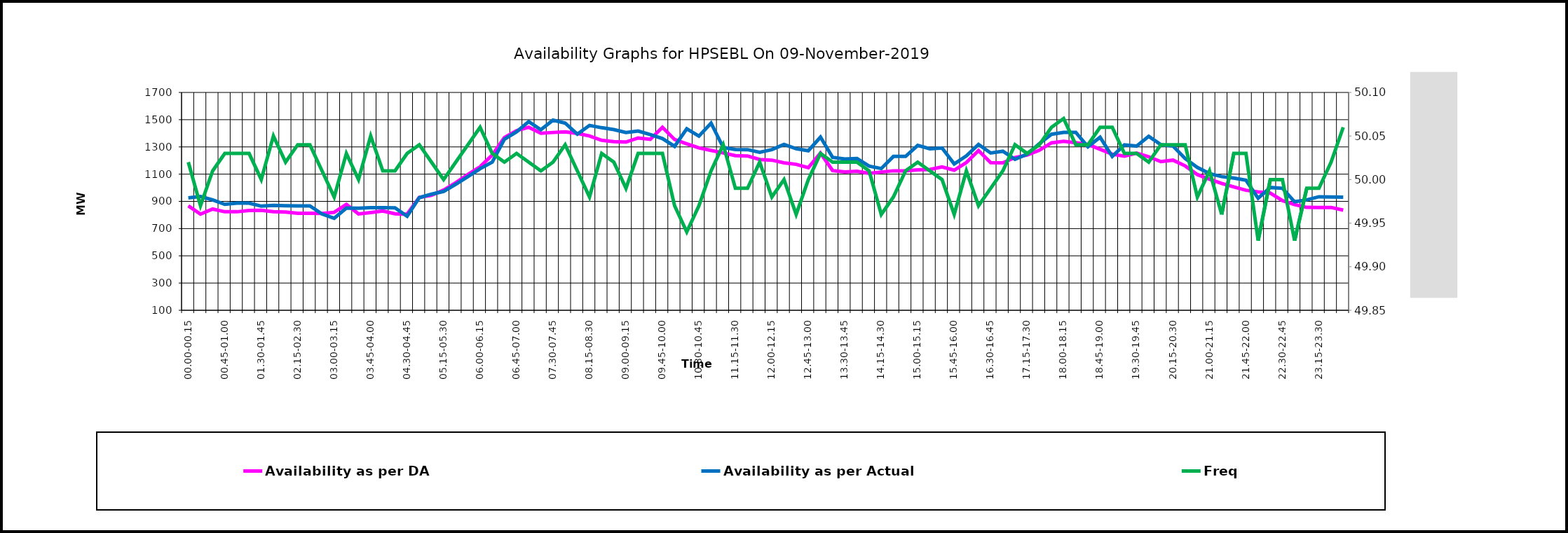
| Category | Availability as per DA | Availability as per Actual |
|---|---|---|
| 00.00-00.15 | 867.346 | 926 |
| 00.15-00.30 | 805.943 | 936 |
| 00.30-00.45 | 843.511 | 911 |
| 00.45-01.00 | 823.511 | 878 |
| 01.00-01.15 | 823.511 | 887 |
| 01.15-01.30 | 833.511 | 887 |
| 01.30-01.45 | 834.676 | 865 |
| 01.45-02:00 | 824.676 | 870 |
| 02.00-02.15 | 822.068 | 868 |
| 02.15-02.30 | 812.068 | 867 |
| 02.30-02.45 | 812.068 | 867 |
| 02.45-03:00 | 811.412 | 807 |
| 03.00-03.15 | 819.3 | 776 |
| 03.15-03.30 | 877.586 | 851 |
| 03.30-03.45 | 807.3 | 850 |
| 03.45-04.00 | 817.3 | 854 |
| 04.00-04.15 | 829.131 | 854 |
| 04.15-04.30 | 809.141 | 853 |
| 04.30-04.45 | 805.678 | 791 |
| 04.45-05.00 | 929.084 | 927 |
| 05.00-05.15 | 944.459 | 953 |
| 05.15-05.30 | 983.251 | 973 |
| 05.30-05.45 | 1037.119 | 1026 |
| 05.45-06.00 | 1098.165 | 1082 |
| 06.00-06.15 | 1154.524 | 1140 |
| 06.15-06.30 | 1240.441 | 1189 |
| 06.30-06.45 | 1368.178 | 1356 |
| 06.45-07.00 | 1419.502 | 1411 |
| 07.00-07.15 | 1444.263 | 1486 |
| 07.15-07.30 | 1400.936 | 1426 |
| 07.30-07.45 | 1406.117 | 1497 |
| 07.45-08.00 | 1410.971 | 1475 |
| 08.00-08.15 | 1399.314 | 1394 |
| 08.15-08.30 | 1380.4 | 1458 |
| 08.30-08.45 | 1348.415 | 1441 |
| 08.45-09.00 | 1338.3 | 1427 |
| 09.00-09.15 | 1335.678 | 1406 |
| 09.15-09.30 | 1365.776 | 1417 |
| 09.30-09.45 | 1355.688 | 1391 |
| 09.45-10.00 | 1444.432 | 1361 |
| 10.00-10.15 | 1354.321 | 1304 |
| 10.15-10.30 | 1322.477 | 1433 |
| 10.30-10.45 | 1292.801 | 1379 |
| 10.45-11.00 | 1273.914 | 1475 |
| 11.00-11.15 | 1255.558 | 1296 |
| 11.15-11.30 | 1235.553 | 1281 |
| 11.30-11.45 | 1233.592 | 1280 |
| 11.45-12.00 | 1207.525 | 1261 |
| 12.00-12.15 | 1202.742 | 1280 |
| 12.15-12.30 | 1182.997 | 1318 |
| 12.30-12.45 | 1172.211 | 1287 |
| 12.45-13.00 | 1147.497 | 1272 |
| 13.00-13.15 | 1254.367 | 1372 |
| 13.15-13.30 | 1126.102 | 1223 |
| 13.30-13.45 | 1116.597 | 1211 |
| 13.45-14.00 | 1121.461 | 1215 |
| 14.00-14.15 | 1105.986 | 1159 |
| 14.15-14.30 | 1115.397 | 1141 |
| 14.30-14.45 | 1124.407 | 1230 |
| 14.45-15.00 | 1123.468 | 1230 |
| 15.00-15.15 | 1130.92 | 1311 |
| 15.15-15.30 | 1133.889 | 1286 |
| 15.30-15.45 | 1153.317 | 1292 |
| 15.45-16.00 | 1128.881 | 1175 |
| 16.00-16.15 | 1185.518 | 1234 |
| 16.15-16.30 | 1273.504 | 1318 |
| 16.30-16.45 | 1184.489 | 1255 |
| 16.45-17.00 | 1182.771 | 1268 |
| 17.00-17.15 | 1222.398 | 1209 |
| 17.15-17.30 | 1239.917 | 1247 |
| 17.30-17.45 | 1275.266 | 1324 |
| 17.45-18.00 | 1329.85 | 1393 |
| 18.00-18.15 | 1340.69 | 1407 |
| 18.15-18.30 | 1330.486 | 1407 |
| 18.30-18.45 | 1318.696 | 1301 |
| 18.45-19.00 | 1282.576 | 1371 |
| 19.00-19.15 | 1246.613 | 1230 |
| 19.15-19.30 | 1232.246 | 1315 |
| 19.30-19.45 | 1254.226 | 1306 |
| 19.45-20.00 | 1226.984 | 1378 |
| 20.00-20.15 | 1191.656 | 1316 |
| 20.15-20.30 | 1202.766 | 1306 |
| 20.30-20.45 | 1160.527 | 1214 |
| 20.45-21.00 | 1097.11 | 1149 |
| 21.00-21.15 | 1062.882 | 1104 |
| 21.15-21.30 | 1032.061 | 1082 |
| 21.30-21.45 | 1005.884 | 1071 |
| 21.45-22.00 | 981.736 | 1055 |
| 22.00-22.15 | 969.54 | 923 |
| 22.15-22.30 | 960.978 | 1002 |
| 22.30-22.45 | 905.837 | 996 |
| 22.45-23.00 | 876.185 | 897 |
| 23.00-23.15 | 855.66 | 911 |
| 23.15-23.30 | 855.539 | 934 |
| 23.30-23.45 | 855.539 | 932 |
| 23.45-24.00 | 835.539 | 931 |